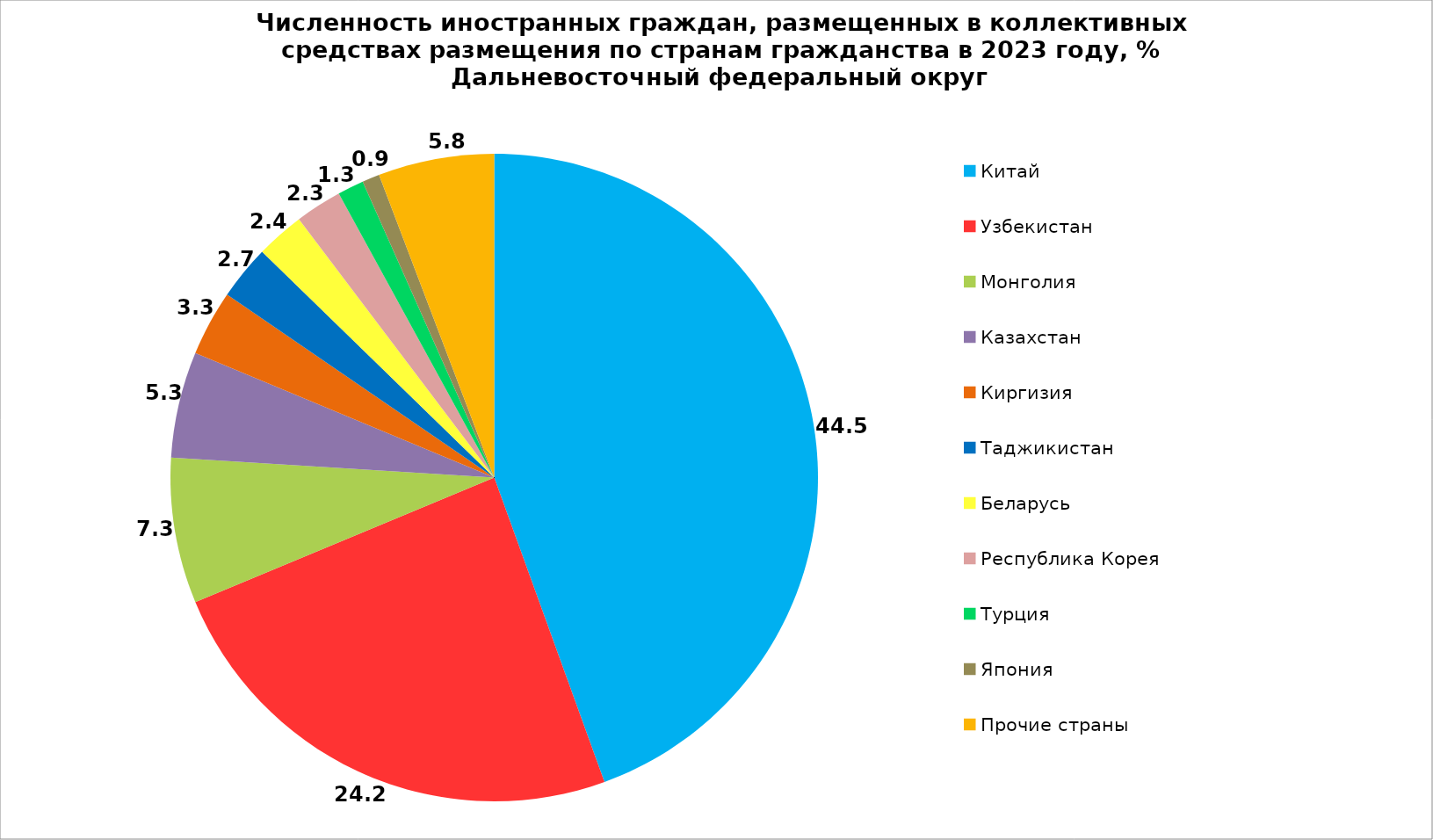
| Category | Series 0 |
|---|---|
| Китай | 44.469 |
| Узбекистан | 24.249 |
| Монголия | 7.261 |
| Казахстан | 5.301 |
| Киргизия | 3.276 |
| Таджикистан | 2.72 |
| Беларусь | 2.419 |
| Республика Корея | 2.334 |
| Турция | 1.312 |
| Япония | 0.867 |
| Прочие страны | 5.79 |